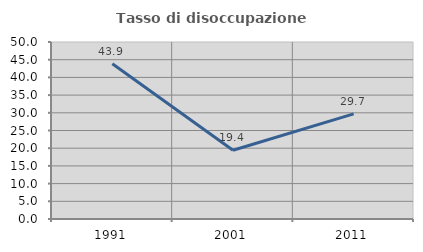
| Category | Tasso di disoccupazione giovanile  |
|---|---|
| 1991.0 | 43.85 |
| 2001.0 | 19.415 |
| 2011.0 | 29.7 |